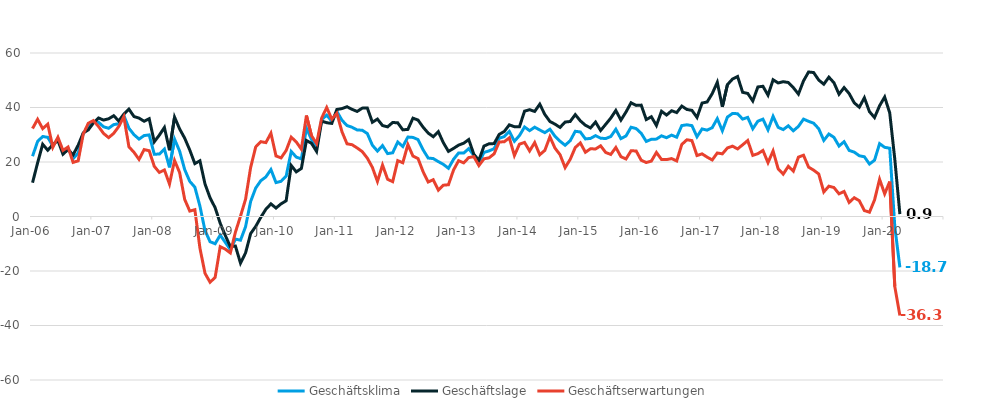
| Category | Geschäftsklima | Geschäftslage | Geschäftserwartungen |
|---|---|---|---|
| 2006-01-01 | 22.123 | 12.408 | 32.281 |
| 2006-02-01 | 27.534 | 19.686 | 35.663 |
| 2006-03-01 | 29.363 | 26.514 | 32.247 |
| 2006-04-01 | 29.049 | 24.32 | 33.879 |
| 2006-05-01 | 25.895 | 26.377 | 25.413 |
| 2006-06-01 | 28.513 | 27.933 | 29.093 |
| 2006-07-01 | 23.555 | 22.862 | 24.249 |
| 2006-08-01 | 25.024 | 24.568 | 25.482 |
| 2006-09-01 | 21.24 | 22.628 | 19.861 |
| 2006-10-01 | 23.285 | 26.183 | 20.425 |
| 2006-11-01 | 30.474 | 30.665 | 30.284 |
| 2006-12-01 | 33.005 | 31.787 | 34.229 |
| 2007-01-01 | 34.758 | 34.319 | 35.197 |
| 2007-02-01 | 34.601 | 36.165 | 33.047 |
| 2007-03-01 | 32.924 | 35.393 | 30.48 |
| 2007-04-01 | 32.377 | 35.851 | 28.954 |
| 2007-05-01 | 33.716 | 36.977 | 30.5 |
| 2007-06-01 | 34.044 | 35.061 | 33.032 |
| 2007-07-01 | 37.095 | 37.57 | 36.62 |
| 2007-08-01 | 32.389 | 39.404 | 25.579 |
| 2007-09-01 | 30.025 | 36.686 | 23.552 |
| 2007-10-01 | 28.403 | 36.101 | 20.957 |
| 2007-11-01 | 29.697 | 34.95 | 24.561 |
| 2007-12-01 | 29.94 | 35.901 | 24.131 |
| 2008-01-01 | 22.866 | 27.412 | 18.412 |
| 2008-02-01 | 22.91 | 29.861 | 16.169 |
| 2008-03-01 | 24.742 | 32.669 | 17.084 |
| 2008-04-01 | 18.03 | 24.322 | 11.915 |
| 2008-05-01 | 28.375 | 36.465 | 20.562 |
| 2008-06-01 | 23.982 | 32.126 | 16.122 |
| 2008-07-01 | 17.205 | 28.732 | 6.258 |
| 2008-08-01 | 12.892 | 24.384 | 1.989 |
| 2008-09-01 | 10.78 | 19.404 | 2.494 |
| 2008-10-01 | 3.812 | 20.445 | -11.565 |
| 2008-11-01 | -5.135 | 11.944 | -20.837 |
| 2008-12-01 | -9.256 | 6.862 | -24.118 |
| 2009-01-01 | -9.989 | 3.23 | -22.348 |
| 2009-02-01 | -6.831 | -2.497 | -11.069 |
| 2009-03-01 | -9.471 | -6.937 | -11.971 |
| 2009-04-01 | -12.219 | -11.059 | -13.371 |
| 2009-05-01 | -8.308 | -10.83 | -5.753 |
| 2009-06-01 | -8.689 | -17.106 | 0.115 |
| 2009-07-01 | -3.752 | -13.349 | 6.338 |
| 2009-08-01 | 5.512 | -6.265 | 18.005 |
| 2009-09-01 | 10.443 | -3.636 | 25.533 |
| 2009-10-01 | 13.128 | -0.308 | 27.468 |
| 2009-11-01 | 14.532 | 2.656 | 27.105 |
| 2009-12-01 | 17.22 | 4.642 | 30.571 |
| 2010-01-01 | 12.443 | 3.099 | 22.216 |
| 2010-02-01 | 12.915 | 4.655 | 21.509 |
| 2010-03-01 | 14.798 | 5.774 | 24.218 |
| 2010-04-01 | 23.851 | 18.716 | 29.107 |
| 2010-05-01 | 21.801 | 16.378 | 27.359 |
| 2010-06-01 | 21.135 | 17.617 | 24.709 |
| 2010-07-01 | 32.433 | 27.901 | 37.055 |
| 2010-08-01 | 28.266 | 26.862 | 29.677 |
| 2010-09-01 | 25.31 | 23.879 | 26.75 |
| 2010-10-01 | 35.561 | 34.993 | 36.13 |
| 2010-11-01 | 37.19 | 34.421 | 39.992 |
| 2010-12-01 | 34.947 | 34.158 | 35.739 |
| 2011-01-01 | 38.574 | 39.281 | 37.869 |
| 2011-02-01 | 35.33 | 39.598 | 31.138 |
| 2011-03-01 | 33.381 | 40.279 | 26.681 |
| 2011-04-01 | 32.74 | 39.321 | 26.341 |
| 2011-05-01 | 31.756 | 38.548 | 25.157 |
| 2011-06-01 | 31.657 | 39.77 | 23.818 |
| 2011-07-01 | 30.455 | 39.84 | 21.437 |
| 2011-08-01 | 26.155 | 34.59 | 18.023 |
| 2011-09-01 | 24.014 | 35.744 | 12.868 |
| 2011-10-01 | 26.016 | 33.378 | 18.887 |
| 2011-11-01 | 23.08 | 32.897 | 13.677 |
| 2011-12-01 | 23.377 | 34.507 | 12.775 |
| 2012-01-01 | 27.334 | 34.377 | 20.503 |
| 2012-02-01 | 25.682 | 31.8 | 19.725 |
| 2012-03-01 | 29.162 | 31.963 | 26.394 |
| 2012-04-01 | 29.021 | 36.083 | 22.171 |
| 2012-05-01 | 28.223 | 35.39 | 21.274 |
| 2012-06-01 | 24.464 | 32.78 | 16.445 |
| 2012-07-01 | 21.456 | 30.619 | 12.657 |
| 2012-08-01 | 21.251 | 29.287 | 13.497 |
| 2012-09-01 | 20.151 | 31.142 | 9.682 |
| 2012-10-01 | 19.13 | 27.056 | 11.481 |
| 2012-11-01 | 17.692 | 23.898 | 11.657 |
| 2012-12-01 | 20.983 | 24.981 | 17.057 |
| 2013-01-01 | 23.318 | 26.19 | 20.482 |
| 2013-02-01 | 23.265 | 26.901 | 19.687 |
| 2013-03-01 | 24.905 | 28.235 | 21.625 |
| 2013-04-01 | 22.402 | 22.845 | 21.961 |
| 2013-05-01 | 19.661 | 20.634 | 18.693 |
| 2013-06-01 | 23.499 | 25.839 | 21.183 |
| 2013-07-01 | 24.089 | 26.683 | 21.524 |
| 2013-08-01 | 24.869 | 26.76 | 22.995 |
| 2013-09-01 | 28.727 | 30.122 | 27.341 |
| 2013-10-01 | 29.31 | 31.206 | 27.43 |
| 2013-11-01 | 31.239 | 33.631 | 28.871 |
| 2013-12-01 | 27.603 | 32.955 | 22.374 |
| 2014-01-01 | 29.71 | 32.922 | 26.542 |
| 2014-02-01 | 32.852 | 38.654 | 27.19 |
| 2014-03-01 | 31.505 | 39.199 | 24.058 |
| 2014-04-01 | 32.772 | 38.553 | 27.131 |
| 2014-05-01 | 31.748 | 41.211 | 22.657 |
| 2014-06-01 | 30.765 | 37.45 | 24.268 |
| 2014-07-01 | 32.04 | 34.877 | 29.238 |
| 2014-08-01 | 29.457 | 33.892 | 25.107 |
| 2014-09-01 | 27.633 | 32.694 | 22.682 |
| 2014-10-01 | 26.145 | 34.656 | 17.942 |
| 2014-11-01 | 27.81 | 34.872 | 20.96 |
| 2014-12-01 | 31.271 | 37.385 | 25.315 |
| 2015-01-01 | 31.021 | 35.11 | 27.003 |
| 2015-02-01 | 28.471 | 33.48 | 23.569 |
| 2015-03-01 | 28.65 | 32.511 | 24.853 |
| 2015-04-01 | 29.674 | 34.669 | 24.785 |
| 2015-05-01 | 28.735 | 31.568 | 25.936 |
| 2015-06-01 | 28.605 | 33.826 | 23.5 |
| 2015-07-01 | 29.346 | 36.108 | 22.777 |
| 2015-08-01 | 32.02 | 38.904 | 25.333 |
| 2015-09-01 | 28.567 | 35.377 | 21.955 |
| 2015-10-01 | 29.562 | 38.345 | 21.104 |
| 2015-11-01 | 32.756 | 41.738 | 24.107 |
| 2015-12-01 | 32.268 | 40.774 | 24.063 |
| 2016-01-01 | 30.539 | 40.873 | 20.648 |
| 2016-02-01 | 27.552 | 35.568 | 19.808 |
| 2016-03-01 | 28.33 | 36.612 | 20.337 |
| 2016-04-01 | 28.403 | 33.404 | 23.509 |
| 2016-05-01 | 29.607 | 38.618 | 20.936 |
| 2016-06-01 | 28.909 | 37.226 | 20.883 |
| 2016-07-01 | 29.862 | 38.812 | 21.247 |
| 2016-08-01 | 29.091 | 38.138 | 20.388 |
| 2016-09-01 | 33.37 | 40.517 | 26.435 |
| 2016-10-01 | 33.649 | 39.278 | 28.151 |
| 2016-11-01 | 33.346 | 38.956 | 27.868 |
| 2016-12-01 | 29.258 | 36.347 | 22.382 |
| 2017-01-01 | 32.124 | 41.629 | 22.993 |
| 2017-02-01 | 31.687 | 42.033 | 21.784 |
| 2017-03-01 | 32.598 | 45.079 | 20.753 |
| 2017-04-01 | 35.922 | 49.249 | 23.307 |
| 2017-05-01 | 31.453 | 40.234 | 22.994 |
| 2017-06-01 | 36.488 | 48.386 | 25.16 |
| 2017-07-01 | 37.804 | 50.434 | 25.812 |
| 2017-08-01 | 37.725 | 51.385 | 24.806 |
| 2017-09-01 | 35.741 | 45.572 | 26.303 |
| 2017-10-01 | 36.364 | 45.159 | 27.885 |
| 2017-11-01 | 32.2 | 42.395 | 22.434 |
| 2017-12-01 | 34.974 | 47.542 | 23.044 |
| 2018-01-01 | 35.721 | 47.792 | 24.237 |
| 2018-02-01 | 31.812 | 44.526 | 19.759 |
| 2018-03-01 | 36.758 | 50.182 | 24.053 |
| 2018-04-01 | 32.729 | 49.01 | 17.513 |
| 2018-05-01 | 31.888 | 49.464 | 15.55 |
| 2018-06-01 | 33.287 | 49.176 | 18.41 |
| 2018-07-01 | 31.464 | 47.276 | 16.663 |
| 2018-08-01 | 33.072 | 44.926 | 21.792 |
| 2018-09-01 | 35.734 | 49.773 | 22.484 |
| 2018-10-01 | 34.925 | 53.037 | 18.11 |
| 2018-11-01 | 34.232 | 52.822 | 17.008 |
| 2018-12-01 | 32.2 | 50.07 | 15.606 |
| 2019-01-01 | 27.922 | 48.551 | 9.005 |
| 2019-02-01 | 30.27 | 51.145 | 11.129 |
| 2019-03-01 | 29.047 | 49.083 | 10.622 |
| 2019-04-01 | 25.86 | 44.872 | 8.324 |
| 2019-05-01 | 27.452 | 47.311 | 9.187 |
| 2019-06-01 | 24.244 | 45.109 | 5.155 |
| 2019-07-01 | 23.629 | 41.718 | 6.893 |
| 2019-08-01 | 22.292 | 40.121 | 5.787 |
| 2019-09-01 | 21.912 | 43.567 | 2.182 |
| 2019-10-01 | 19.251 | 38.48 | 1.573 |
| 2019-11-01 | 20.663 | 36.309 | 6.052 |
| 2019-12-01 | 26.74 | 40.647 | 13.637 |
| 2020-01-01 | 25.38 | 43.849 | 8.309 |
| 2020-02-01 | 25.057 | 38.001 | 12.818 |
| 2020-03-01 | -3.781 | 20.955 | -25.747 |
| 2020-04-01 | -18.665 | 0.878 | -36.307 |